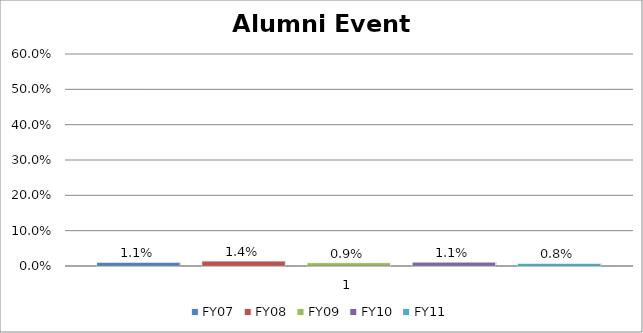
| Category | FY07 | FY08 | FY09 | FY10 | FY11 |
|---|---|---|---|---|---|
| 0 | 0.011 | 0.014 | 0.009 | 0.011 | 0.008 |